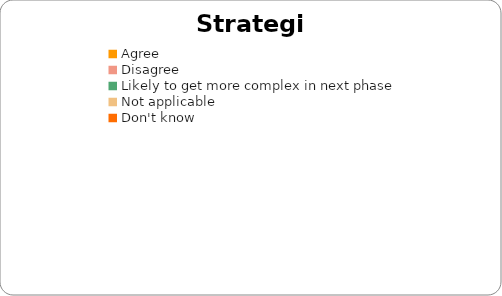
| Category | STRATEGIC |
|---|---|
| Agree | 0 |
| Disagree | 0 |
| Likely to get more complex in next phase | 0 |
| Not applicable | 0 |
| Don't know | 0 |